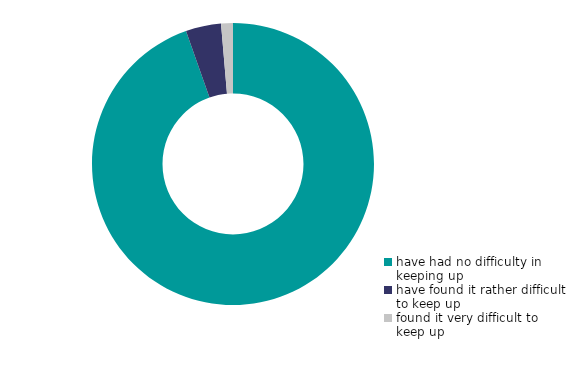
| Category | Series 0 |
|---|---|
| have had no difficulty in keeping up | 94.592 |
| have found it rather difficult to keep up | 4.051 |
| found it very difficult to keep up | 1.357 |